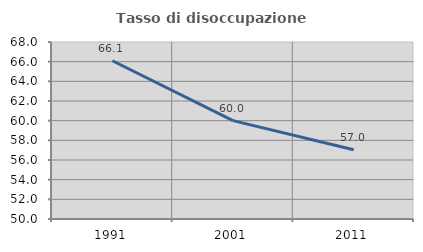
| Category | Tasso di disoccupazione giovanile  |
|---|---|
| 1991.0 | 66.096 |
| 2001.0 | 60 |
| 2011.0 | 57.042 |